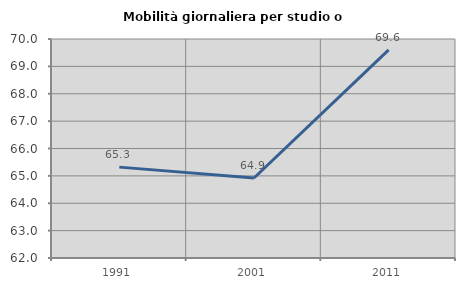
| Category | Mobilità giornaliera per studio o lavoro |
|---|---|
| 1991.0 | 65.319 |
| 2001.0 | 64.923 |
| 2011.0 | 69.6 |